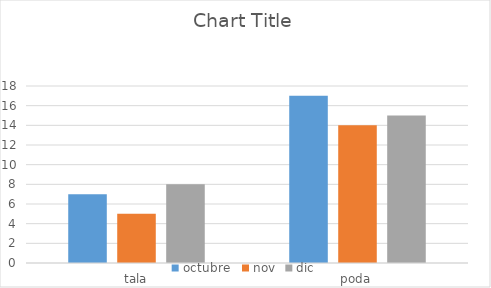
| Category | octubre  | nov | dic |
|---|---|---|---|
| tala | 7 | 5 | 8 |
| poda | 17 | 14 | 15 |